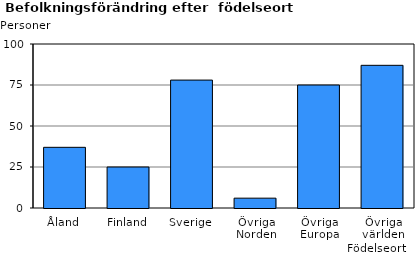
| Category | Series 0 |
|---|---|
| Åland | 37 |
| Finland | 25 |
| Sverige | 78 |
| Övriga Norden | 6 |
| Övriga Europa | 75 |
| Övriga världen | 87 |